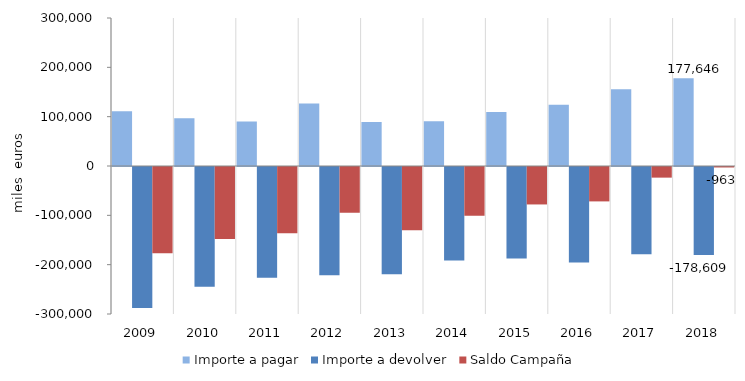
| Category | Importe a pagar | Importe a devolver | Saldo Campaña  |
|---|---|---|---|
| 2009.0 | 111037.303 | -285706.971 | -174669.668 |
| 2010.0 | 96576.254 | -242527.91 | -145951.656 |
| 2011.0 | 90014.588 | -224438.011 | -134423.423 |
| 2012.0 | 126538.987 | -219516.481 | -92977.494 |
| 2013.0 | 89274.189 | -217318.717 | -128044.528 |
| 2014.0 | 90756.111 | -189377.902 | -98621.791 |
| 2015.0 | 109397.392 | -185305.11 | -75907.718 |
| 2016.0 | 124091.908 | -193818.822 | -69726.914 |
| 2017.0 | 155476 | -177028 | -21552 |
| 2018.0 | 177646 | -178609 | -963 |